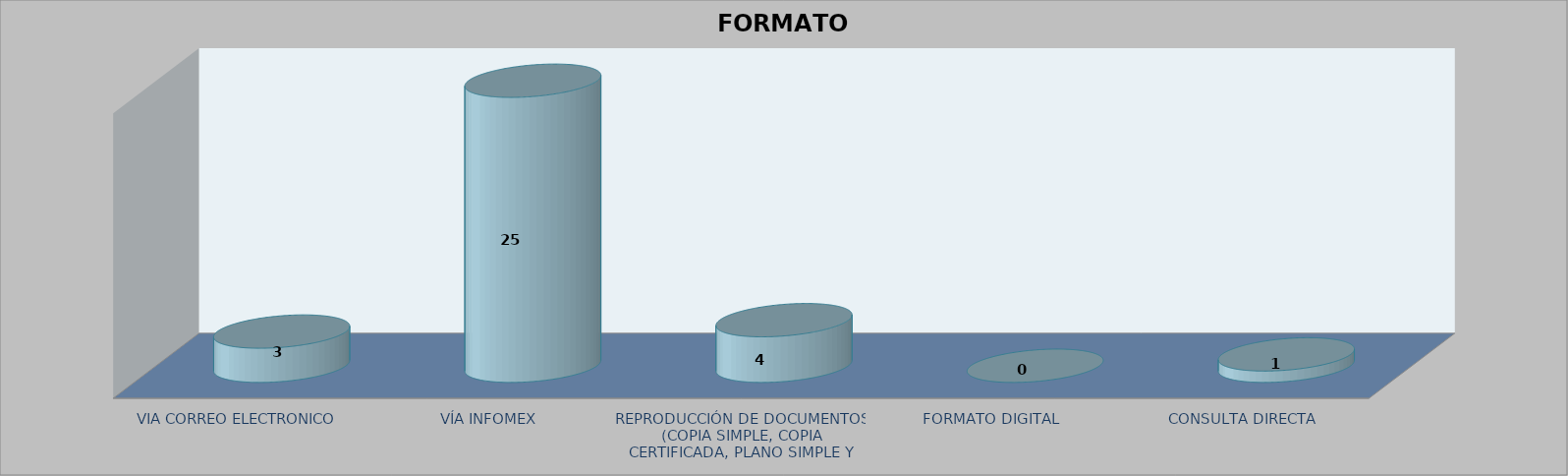
| Category |        FORMATO SOLICITADO | Series 1 | Series 2 |
|---|---|---|---|
| VIA CORREO ELECTRONICO |  |  | 3 |
| VÍA INFOMEX |  |  | 25 |
| REPRODUCCIÓN DE DOCUMENTOS (COPIA SIMPLE, COPIA CERTIFICADA, PLANO SIMPLE Y PLANO CERTIFICADO) |  |  | 4 |
| FORMATO DIGITAL |  |  | 0 |
| CONSULTA DIRECTA |  |  | 1 |